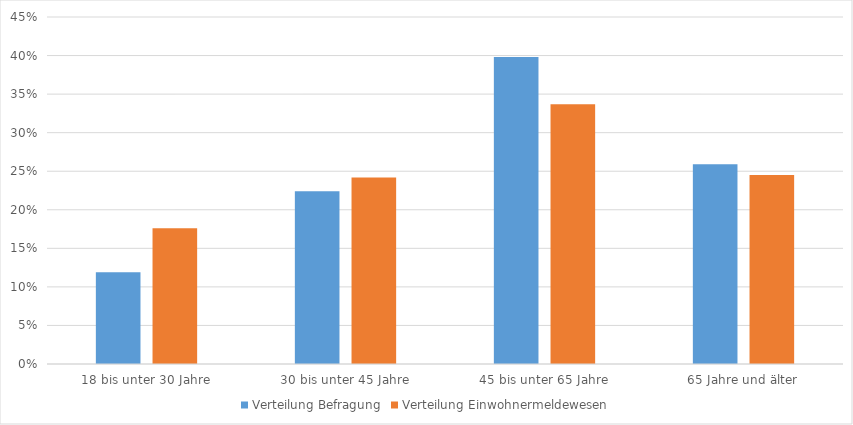
| Category | Verteilung Befragung | Verteilung Einwohnermeldewesen |
|---|---|---|
| 18 bis unter 30 Jahre | 0.119 | 0.176 |
| 30 bis unter 45 Jahre | 0.224 | 0.242 |
| 45 bis unter 65 Jahre | 0.398 | 0.337 |
| 65 Jahre und älter | 0.259 | 0.245 |